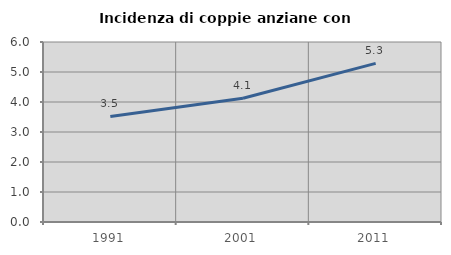
| Category | Incidenza di coppie anziane con figli |
|---|---|
| 1991.0 | 3.519 |
| 2001.0 | 4.124 |
| 2011.0 | 5.288 |